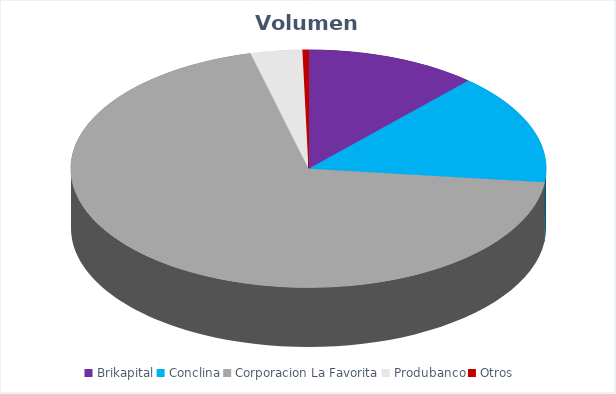
| Category | VOLUMEN ($USD) |
|---|---|
| Brikapital | 10000 |
| Conclina | 12881 |
| Corporacion La Favorita | 59099.43 |
| Produbanco | 3000.16 |
| Otros | 348.15 |